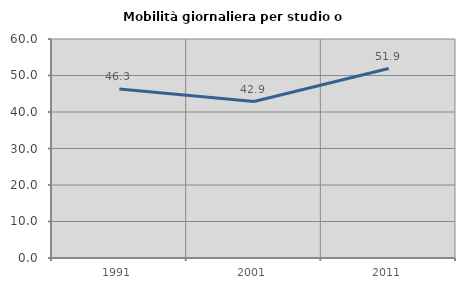
| Category | Mobilità giornaliera per studio o lavoro |
|---|---|
| 1991.0 | 46.281 |
| 2001.0 | 42.87 |
| 2011.0 | 51.896 |